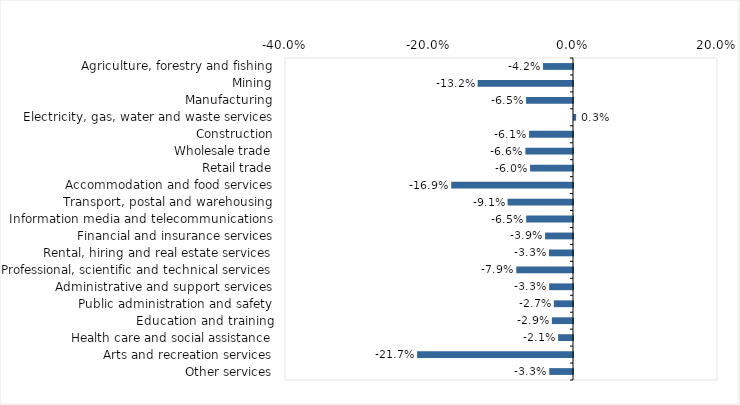
| Category | This week |
|---|---|
| Agriculture, forestry and fishing | -0.042 |
| Mining | -0.132 |
| Manufacturing | -0.065 |
| Electricity, gas, water and waste services | 0.003 |
| Construction | -0.061 |
| Wholesale trade | -0.066 |
| Retail trade | -0.06 |
| Accommodation and food services | -0.169 |
| Transport, postal and warehousing | -0.091 |
| Information media and telecommunications | -0.065 |
| Financial and insurance services | -0.039 |
| Rental, hiring and real estate services | -0.033 |
| Professional, scientific and technical services | -0.079 |
| Administrative and support services | -0.033 |
| Public administration and safety | -0.027 |
| Education and training | -0.029 |
| Health care and social assistance | -0.021 |
| Arts and recreation services | -0.217 |
| Other services | -0.033 |